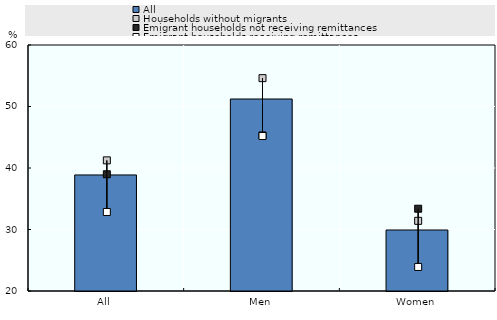
| Category | All |
|---|---|
| All | 38.87 |
| Men | 51.22 |
| Women | 29.92 |